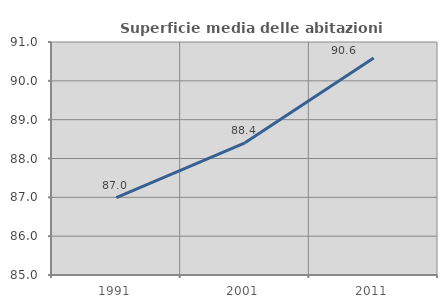
| Category | Superficie media delle abitazioni occupate |
|---|---|
| 1991.0 | 86.993 |
| 2001.0 | 88.404 |
| 2011.0 | 90.585 |